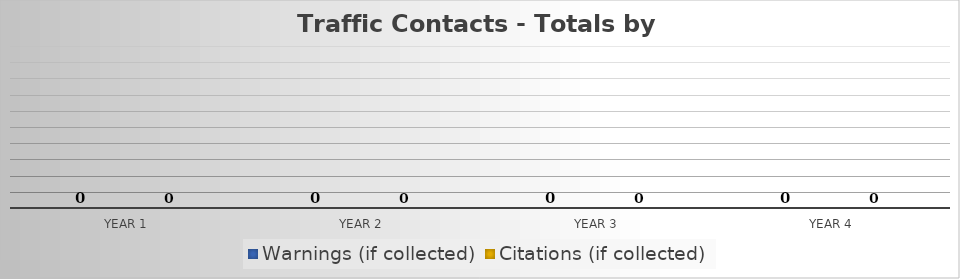
| Category | Warnings (if collected) | Citations (if collected) |
|---|---|---|
| Year 1 | 0 | 0 |
| Year 2 | 0 | 0 |
| Year 3 | 0 | 0 |
| Year 4 | 0 | 0 |